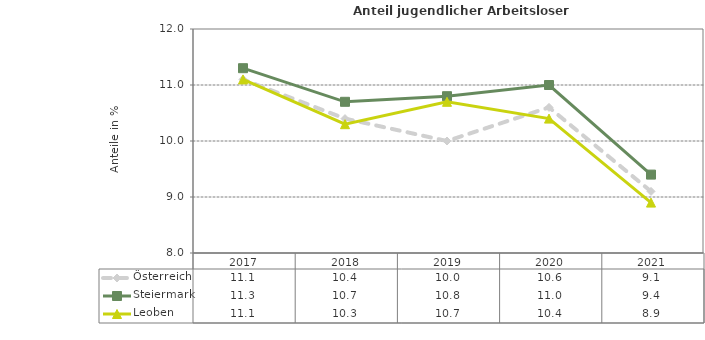
| Category | Österreich | Steiermark | Leoben |
|---|---|---|---|
| 2021.0 | 9.1 | 9.4 | 8.9 |
| 2020.0 | 10.6 | 11 | 10.4 |
| 2019.0 | 10 | 10.8 | 10.7 |
| 2018.0 | 10.4 | 10.7 | 10.3 |
| 2017.0 | 11.1 | 11.3 | 11.1 |